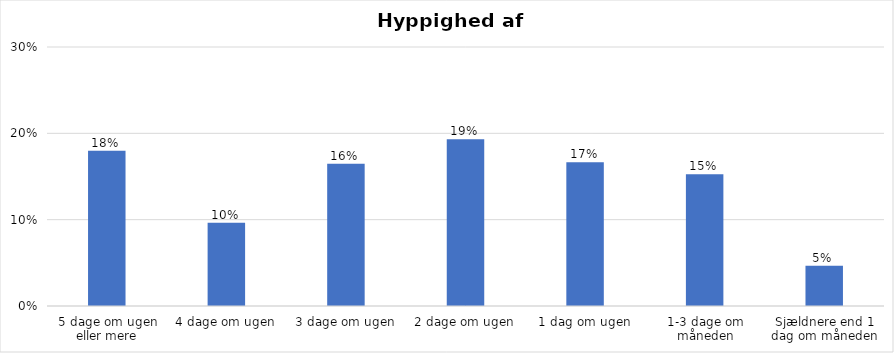
| Category | % |
|---|---|
| 5 dage om ugen eller mere | 0.18 |
| 4 dage om ugen | 0.097 |
| 3 dage om ugen | 0.165 |
| 2 dage om ugen | 0.193 |
| 1 dag om ugen | 0.167 |
| 1-3 dage om måneden | 0.152 |
| Sjældnere end 1 dag om måneden | 0.047 |